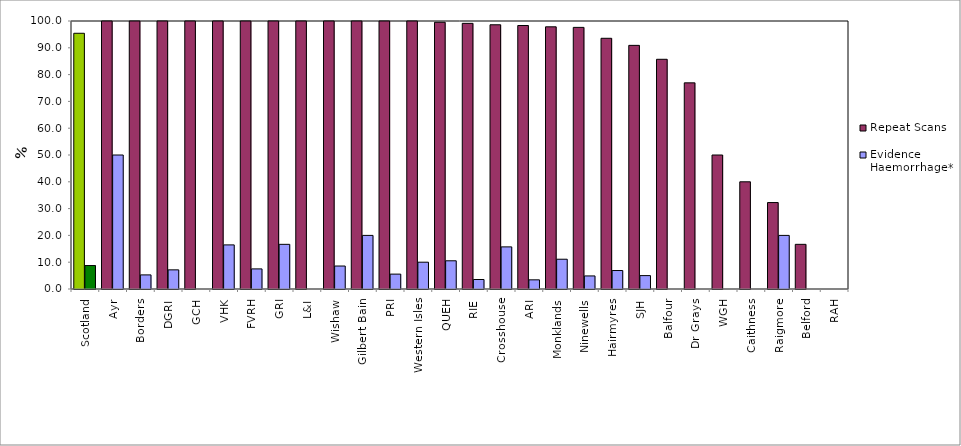
| Category | Repeat Scans | Evidence Haemorrhage* |
|---|---|---|
| Scotland | 95.418 | 8.751 |
| Ayr | 100 | 50 |
| Borders | 100 | 5.263 |
| DGRI | 100 | 7.143 |
| GCH | 100 | 0 |
| VHK | 100 | 16.456 |
| FVRH | 100 | 7.5 |
| GRI | 100 | 16.667 |
| L&I | 100 | 0 |
| Wishaw | 100 | 8.571 |
| Gilbert Bain | 100 | 20 |
| PRI | 100 | 5.556 |
| Western Isles | 100 | 10 |
| QUEH | 99.524 | 10.526 |
| RIE | 99.123 | 3.54 |
| Crosshouse | 98.592 | 15.714 |
| ARI | 98.319 | 3.419 |
| Monklands | 97.826 | 11.111 |
| Ninewells | 97.619 | 4.878 |
| Hairmyres | 93.548 | 6.897 |
| SJH | 90.909 | 5 |
| Balfour | 85.714 | 0 |
| Dr Grays | 76.923 | 0 |
| WGH | 50 | 0 |
| Caithness | 40 | 0 |
| Raigmore | 32.258 | 20 |
| Belford | 16.667 | 0 |
| RAH | 0 | 0 |